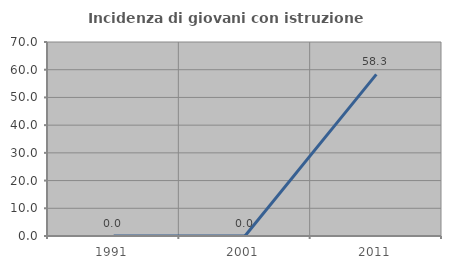
| Category | Incidenza di giovani con istruzione universitaria |
|---|---|
| 1991.0 | 0 |
| 2001.0 | 0 |
| 2011.0 | 58.333 |